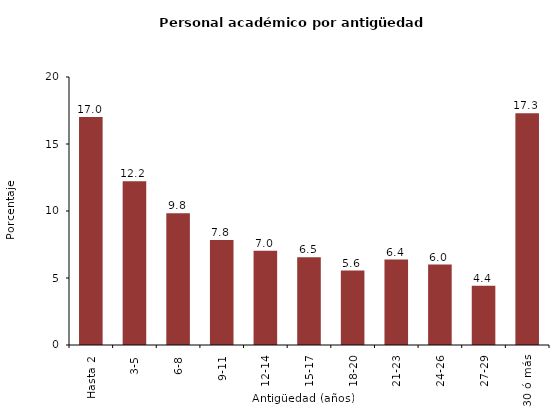
| Category | Series 0 |
|---|---|
| Hasta 2 | 17.007 |
| 3-5 | 12.223 |
| 6-8 | 9.828 |
| 9-11 | 7.832 |
| 12-14 | 7.033 |
| 15-17 | 6.54 |
| 18-20 | 5.557 |
| 21-23 | 6.378 |
| 24-26 | 6 |
| 27-29 | 4.421 |
| 30 ó más | 17.3 |